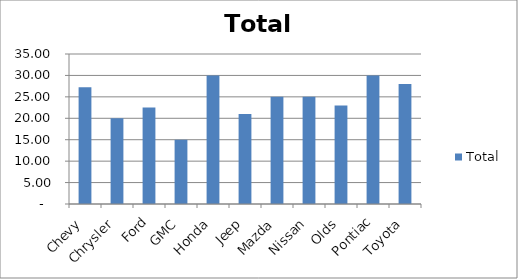
| Category | Total |
|---|---|
| Chevy | 27.25 |
| Chrysler | 20 |
| Ford | 22.5 |
| GMC | 15 |
| Honda | 30 |
| Jeep | 21 |
| Mazda | 25 |
| Nissan | 25 |
| Olds | 23 |
| Pontiac | 30 |
| Toyota | 28 |